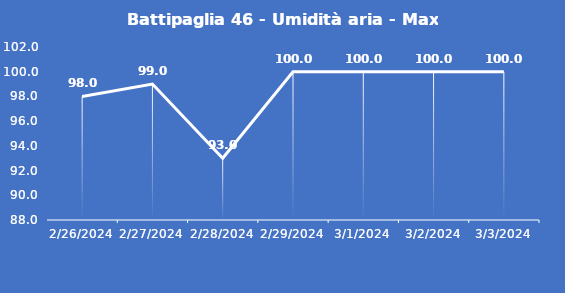
| Category | Battipaglia 46 - Umidità aria - Max (%) |
|---|---|
| 2/26/24 | 98 |
| 2/27/24 | 99 |
| 2/28/24 | 93 |
| 2/29/24 | 100 |
| 3/1/24 | 100 |
| 3/2/24 | 100 |
| 3/3/24 | 100 |